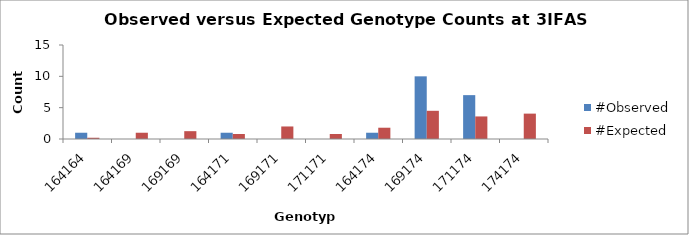
| Category | #Observed | #Expected |
|---|---|---|
| 164164.0 | 1 | 0.2 |
| 164169.0 | 0 | 1 |
| 169169.0 | 0 | 1.25 |
| 164171.0 | 1 | 0.8 |
| 169171.0 | 0 | 2 |
| 171171.0 | 0 | 0.8 |
| 164174.0 | 1 | 1.8 |
| 169174.0 | 10 | 4.5 |
| 171174.0 | 7 | 3.6 |
| 174174.0 | 0 | 4.05 |